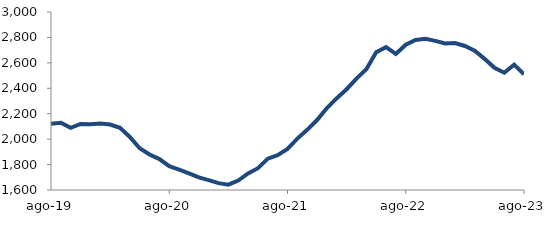
| Category | Series 0 |
|---|---|
| 2019-08-01 | 2121.901 |
| 2019-09-01 | 2128.491 |
| 2019-10-01 | 2088.553 |
| 2019-11-01 | 2119.211 |
| 2019-12-01 | 2116.27 |
| 2020-01-01 | 2123.179 |
| 2020-02-01 | 2115.217 |
| 2020-03-01 | 2088.6 |
| 2020-04-01 | 2017.241 |
| 2020-05-01 | 1928.116 |
| 2020-06-01 | 1878.979 |
| 2020-07-01 | 1843.29 |
| 2020-08-01 | 1787.543 |
| 2020-09-01 | 1760.281 |
| 2020-10-01 | 1731.197 |
| 2020-11-01 | 1698.835 |
| 2020-12-01 | 1677.184 |
| 2021-01-01 | 1654.072 |
| 2021-02-01 | 1641.869 |
| 2021-03-01 | 1673.821 |
| 2021-04-01 | 1730.759 |
| 2021-05-01 | 1771.425 |
| 2021-06-01 | 1846.573 |
| 2021-07-01 | 1874.111 |
| 2021-08-01 | 1922.894 |
| 2021-09-01 | 2004.225 |
| 2021-10-01 | 2073.331 |
| 2021-11-01 | 2150.314 |
| 2021-12-01 | 2244.492 |
| 2022-01-01 | 2321.95 |
| 2022-02-01 | 2392.65 |
| 2022-03-01 | 2476.383 |
| 2022-04-01 | 2549.069 |
| 2022-05-01 | 2683.336 |
| 2022-06-01 | 2723.868 |
| 2022-07-01 | 2670.585 |
| 2022-08-01 | 2742.913 |
| 2022-09-01 | 2780.46 |
| 2022-10-01 | 2788.916 |
| 2022-11-01 | 2772.628 |
| 2022-12-01 | 2752.307 |
| 2023-01-01 | 2755.69 |
| 2023-02-01 | 2732.653 |
| 2023-03-01 | 2696.107 |
| 2023-04-01 | 2631.454 |
| 2023-05-01 | 2561.826 |
| 2023-06-01 | 2522.703 |
| 2023-07-01 | 2586.296 |
| 2023-08-01 | 2509.777 |